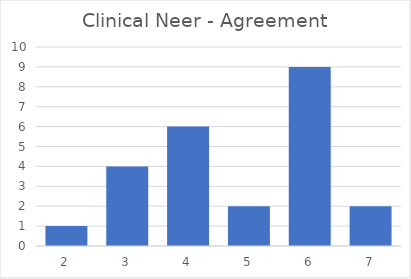
| Category | Full Neer | Clinical Neer |
|---|---|---|
| 1.0 | 0 | 0 |
| 2.0 | 5 | 1 |
| 3.0 | 5 | 4 |
| 4.0 | 3 | 6 |
| 5.0 | 4 | 2 |
| 6.0 | 6 | 9 |
| 7.0 | 1 | 2 |